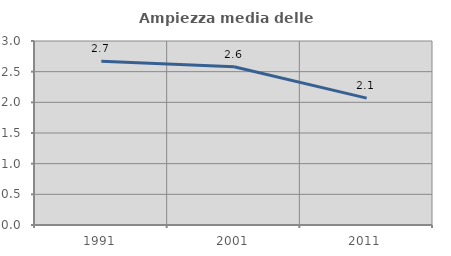
| Category | Ampiezza media delle famiglie |
|---|---|
| 1991.0 | 2.669 |
| 2001.0 | 2.58 |
| 2011.0 | 2.068 |